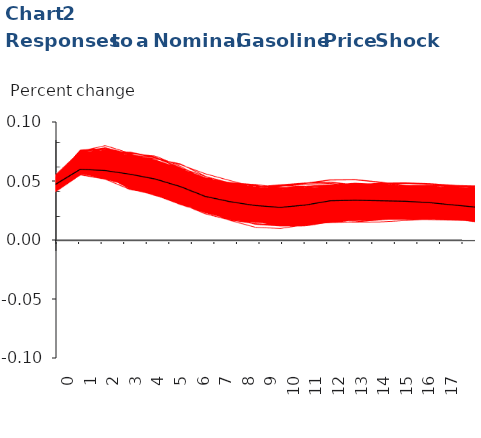
| Category | Median |
|---|---|
| 0.0 | 0.046 |
| 1.0 | 0.058 |
| 2.0 | 0.057 |
| 3.0 | 0.054 |
| 4.0 | 0.05 |
| 5.0 | 0.044 |
| 6.0 | 0.036 |
| 7.0 | 0.032 |
| 8.0 | 0.029 |
| 9.0 | 0.027 |
| 10.0 | 0.029 |
| 11.0 | 0.033 |
| 12.0 | 0.033 |
| 13.0 | 0.033 |
| 14.0 | 0.032 |
| 15.0 | 0.031 |
| 16.0 | 0.029 |
| 17.0 | 0.027 |